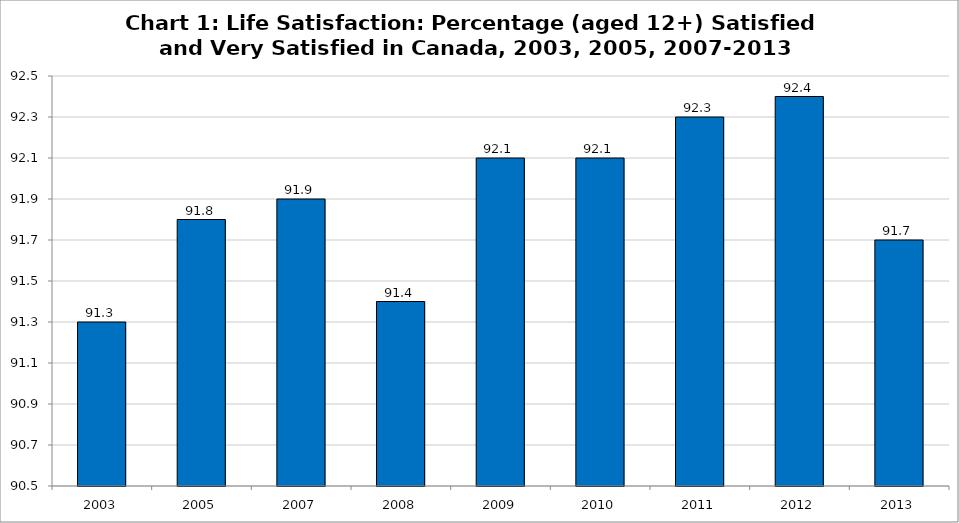
| Category | Canada |
|---|---|
| 2003 | 91.3 |
| 2005 | 91.8 |
| 2007 | 91.9 |
| 2008 | 91.4 |
| 2009 | 92.1 |
| 2010 | 92.1 |
| 2011 | 92.3 |
| 2012 | 92.4 |
| 2013 | 91.7 |